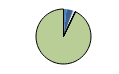
| Category | Series 0 |
|---|---|
| ARRASTRE | 14 |
| CERCO | 28 |
| ATUNEROS CAÑEROS | 3 |
| PALANGRE DE FONDO | 10 |
| PALANGRE DE SUPERFICIE | 1 |
| RASCO | 0 |
| VOLANTA | 0 |
| ARTES FIJAS | 1 |
| ARTES MENORES | 736 |